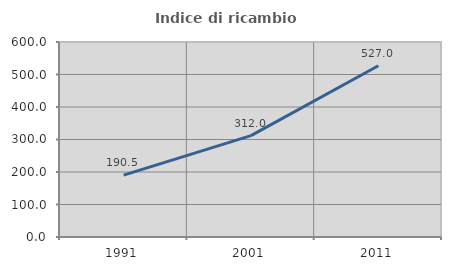
| Category | Indice di ricambio occupazionale  |
|---|---|
| 1991.0 | 190.541 |
| 2001.0 | 312 |
| 2011.0 | 527.027 |